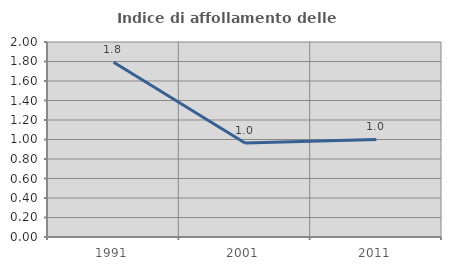
| Category | Indice di affollamento delle abitazioni  |
|---|---|
| 1991.0 | 1.792 |
| 2001.0 | 0.963 |
| 2011.0 | 1.001 |